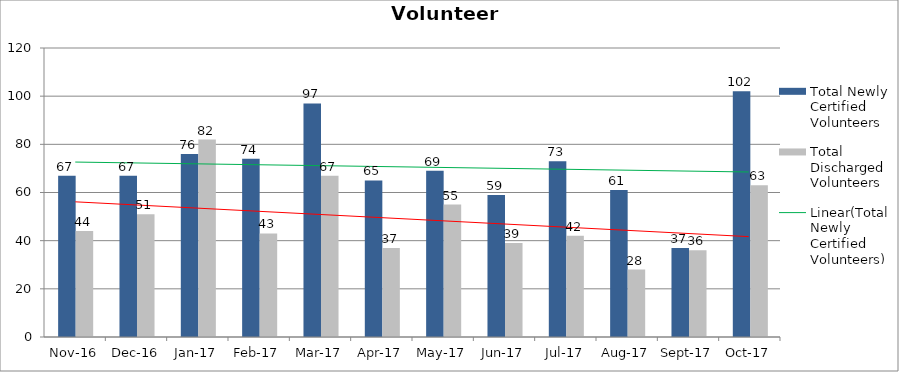
| Category | Total Newly Certified Volunteers | Total Discharged Volunteers |
|---|---|---|
| 2016-11-01 | 67 | 44 |
| 2016-12-01 | 67 | 51 |
| 2017-01-01 | 76 | 82 |
| 2017-02-01 | 74 | 43 |
| 2017-03-01 | 97 | 67 |
| 2017-04-01 | 65 | 37 |
| 2017-05-01 | 69 | 55 |
| 2017-06-01 | 59 | 39 |
| 2017-07-01 | 73 | 42 |
| 2017-08-01 | 61 | 28 |
| 2017-09-01 | 37 | 36 |
| 2017-10-01 | 102 | 63 |